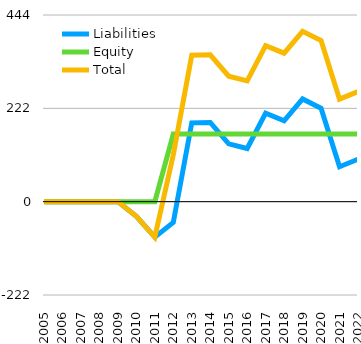
| Category | Liabilities  | Equity  | Total  |
|---|---|---|---|
| 2005 | 0 | 0 | 0 |
| 2006 | 0 | 0 | 0 |
| 2007 | 0 | 0 | 0 |
| 2008 | 0 | 0 | 0 |
| 2009 | 0 | 0 | 0 |
| 2010 | -35 | 0 | -35 |
| 2011 | -84.4 | 0 | -84.4 |
| 2012 | -49.4 | 161 | 111.6 |
| 2013 | 187.6 | 161 | 348.6 |
| 2014 | 188.6 | 161 | 349.6 |
| 2015 | 137.6 | 161 | 298.6 |
| 2016 | 126.6 | 161 | 287.6 |
| 2017 | 210.6 | 161 | 371.6 |
| 2018 | 192.6 | 161 | 353.6 |
| 2019 | 244.6 | 161 | 405.6 |
| 2020 | 222.6 | 161 | 383.6 |
| 2021 | 83.072 | 161 | 244.072 |
| 2022 | 101.172 | 161 | 262.172 |